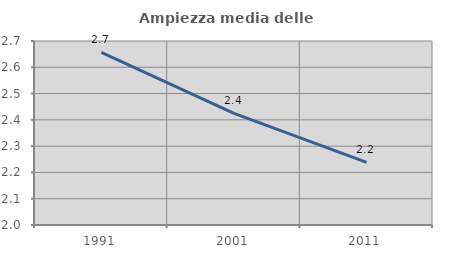
| Category | Ampiezza media delle famiglie |
|---|---|
| 1991.0 | 2.656 |
| 2001.0 | 2.425 |
| 2011.0 | 2.238 |